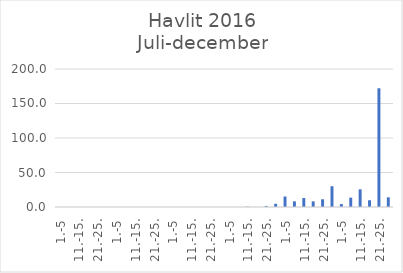
| Category | Series 0 |
|---|---|
| 1.-5 | 0 |
| 6.-10. | 0 |
| 11.-15. | 0 |
| 16.-20. | 0 |
| 21.-25. | 0 |
| 26.-31. | 0 |
| 1.-5 | 0 |
| 6.-10. | 0 |
| 11.-15. | 0 |
| 16.-20. | 0 |
| 21.-25. | 0 |
| 26.-31. | 0 |
| 1.-5 | 0 |
| 6.-10. | 0 |
| 11.-15. | 0 |
| 16.-20. | 0 |
| 21.-25. | 0 |
| 26.-30. | 0 |
| 1.-5 | 0.018 |
| 6.-10. | 0 |
| 11.-15. | 0.518 |
| 16.-20. | 0.028 |
| 21.-25. | 1.535 |
| 26.-31. | 4.604 |
| 1.-5 | 15.223 |
| 6.-10. | 8.211 |
| 11.-15. | 12.988 |
| 16.-20. | 8.184 |
| 21.-25. | 11.195 |
| 26.-30. | 30.134 |
| 1.-5 | 4.297 |
| 6.-10. | 13.556 |
| 11.-15. | 25.626 |
| 16.-20. | 9.8 |
| 21.-25. | 172.055 |
| 26.-31. | 14.04 |